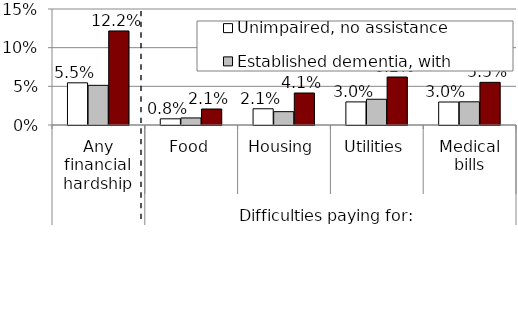
| Category | Unimpaired, no assistance | Established dementia, with assistance | Established dementia, without assistance |
|---|---|---|---|
| 0 | 0.055 | 0.051 | 0.122 |
| 1 | 0.008 | 0.009 | 0.021 |
| 2 | 0.021 | 0.017 | 0.041 |
| 3 | 0.03 | 0.033 | 0.062 |
| 4 | 0.03 | 0.03 | 0.055 |